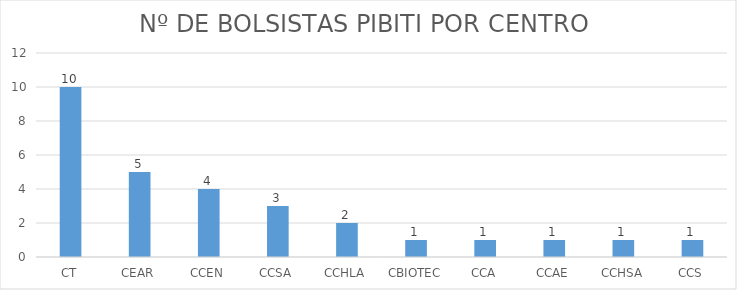
| Category | QTD |
|---|---|
| CT | 10 |
| CEAR | 5 |
| CCEN | 4 |
| CCSA | 3 |
| CCHLA | 2 |
| CBIOTEC | 1 |
| CCA | 1 |
| CCAE | 1 |
| CCHSA | 1 |
| CCS | 1 |